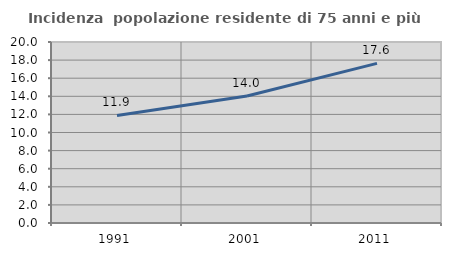
| Category | Incidenza  popolazione residente di 75 anni e più |
|---|---|
| 1991.0 | 11.88 |
| 2001.0 | 14.029 |
| 2011.0 | 17.635 |